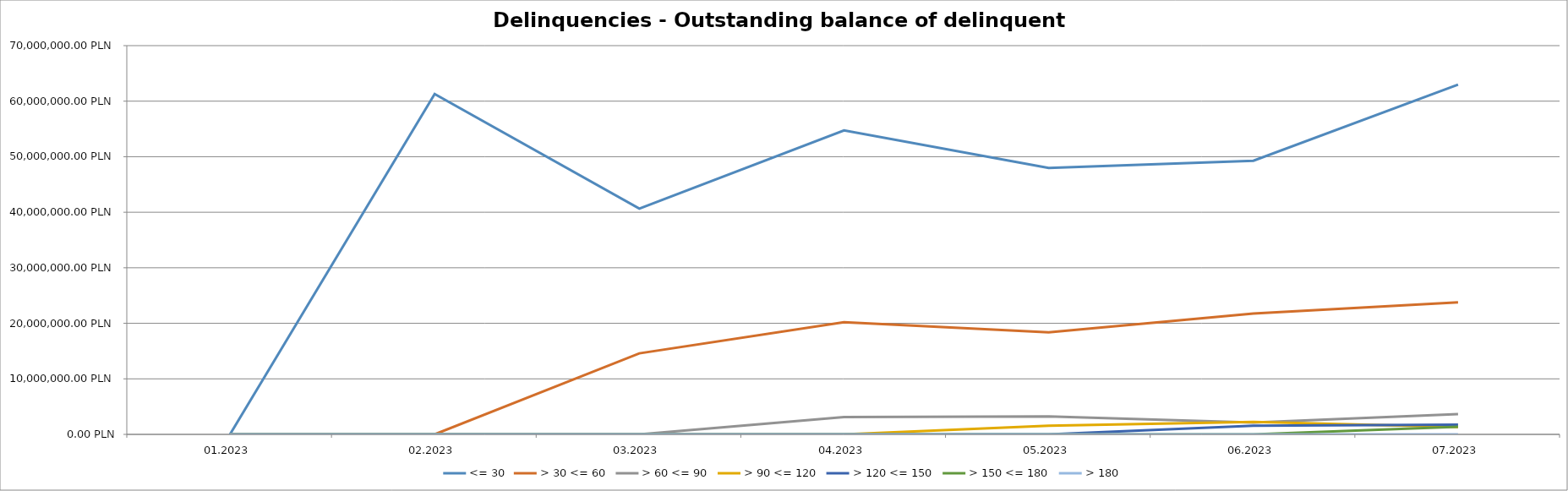
| Category | <= 30 | > 30 <= 60 | > 60 <= 90 | > 90 <= 120 | > 120 <= 150 | > 150 <= 180 | > 180 |
|---|---|---|---|---|---|---|---|
| 01.2023 | 0 | 0 | 0 | 0 | 0 | 0 | 0 |
| 02.2023 | 61279332.52 | 0 | 0 | 0 | 0 | 0 | 0 |
| 03.2023 | 40663789.15 | 14592814.21 | 0 | 0 | 0 | 0 | 0 |
| 04.2023 | 54729258.98 | 20207986.71 | 3105470.81 | 0 | 0 | 0 | 0 |
| 05.2023 | 47980491.52 | 18365026.23 | 3236930.39 | 1575049.71 | 0 | 0 | 0 |
| 06.2023 | 49274463.43 | 21757116.33 | 2145346.9 | 2234258.08 | 1546159.58 | 0 | 0 |
| 07.2023 | 62971390.96 | 23765504.45 | 3638339.96 | 1315739.52 | 1741228.92 | 1367122.32 | 0 |